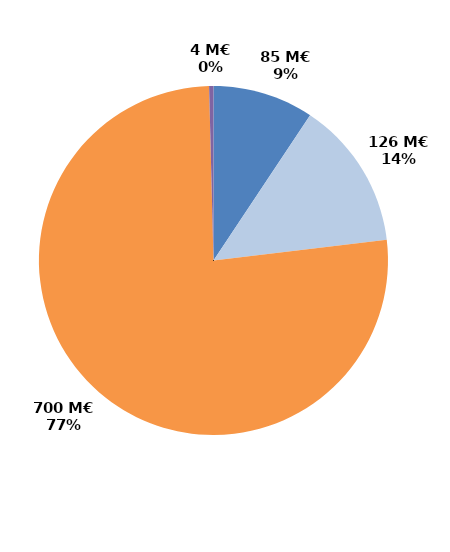
| Category | Series 0 |
|---|---|
| CIF - CPF | 85.465 |
| Période de professionnalisation | 125.854 |
| Plan de formation | 700.047 |
| Autres | 3.688 |